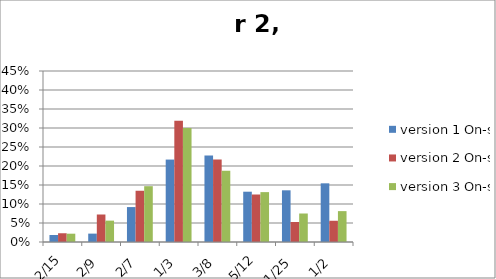
| Category | version 1 On-site | version 2 On-site | version 3 On-site |
|---|---|---|---|
| 0.13333333333333333 | 0.018 | 0.023 | 0.022 |
| 0.2222222222222222 | 0.022 | 0.072 | 0.056 |
| 0.2857142857142857 | 0.092 | 0.135 | 0.147 |
| 0.3333333333333333 | 0.217 | 0.319 | 0.3 |
| 0.375 | 0.228 | 0.217 | 0.188 |
| 0.4166666666666667 | 0.132 | 0.125 | 0.131 |
| 0.44 | 0.136 | 0.053 | 0.075 |
| 0.5 | 0.154 | 0.056 | 0.081 |